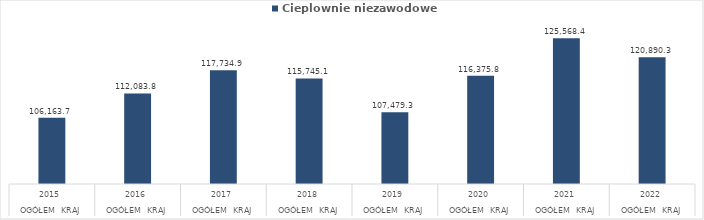
| Category | Cieplownie niezawodowe |
|---|---|
| 0 | 106163.7 |
| 1 | 112083.8 |
| 2 | 117734.9 |
| 3 | 115745.1 |
| 4 | 107479.3 |
| 5 | 116375.8 |
| 6 | 125568.4 |
| 7 | 120890.3 |